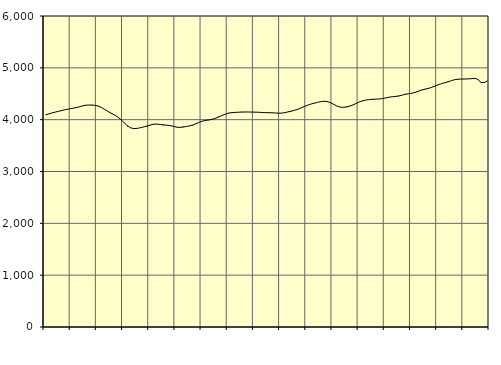
| Category | Piggar | Series 1 |
|---|---|---|
| nan | 4091.3 | 4093.21 |
| 87.0 | 4110.1 | 4111.59 |
| 87.0 | 4133.1 | 4130.63 |
| 87.0 | 4145.6 | 4147.31 |
| nan | 4162.5 | 4162.02 |
| 88.0 | 4176.1 | 4177.18 |
| 88.0 | 4191.3 | 4191.93 |
| 88.0 | 4205.8 | 4204.94 |
| nan | 4212.8 | 4216.74 |
| 89.0 | 4230.8 | 4228.42 |
| 89.0 | 4241.4 | 4242.96 |
| 89.0 | 4258.3 | 4260.81 |
| nan | 4284 | 4275.98 |
| 90.0 | 4281.9 | 4282.55 |
| 90.0 | 4276 | 4281.77 |
| 90.0 | 4276.9 | 4276.85 |
| nan | 4266.3 | 4263.46 |
| 91.0 | 4240.1 | 4237.16 |
| 91.0 | 4198.9 | 4200.55 |
| 91.0 | 4162.4 | 4161.37 |
| nan | 4119.5 | 4125.39 |
| 92.0 | 4096 | 4091.65 |
| 92.0 | 4055.5 | 4053.82 |
| 92.0 | 4009.6 | 4002.81 |
| nan | 3943.5 | 3940.45 |
| 93.0 | 3871.2 | 3881.8 |
| 93.0 | 3846.6 | 3841.93 |
| 93.0 | 3828.3 | 3827.55 |
| nan | 3831 | 3832.24 |
| 94.0 | 3847.7 | 3845.64 |
| 94.0 | 3858.9 | 3860.38 |
| 94.0 | 3869.7 | 3876.77 |
| nan | 3889.7 | 3896.76 |
| 95.0 | 3919 | 3912.35 |
| 95.0 | 3916.5 | 3914.88 |
| 95.0 | 3899.5 | 3906.78 |
| nan | 3916.6 | 3898.05 |
| 96.0 | 3889.5 | 3893.23 |
| 96.0 | 3886.3 | 3885.99 |
| 96.0 | 3877.9 | 3871.53 |
| nan | 3852.3 | 3856.67 |
| 97.0 | 3847.8 | 3850.93 |
| 97.0 | 3864.8 | 3857.55 |
| 97.0 | 3870.2 | 3868.7 |
| nan | 3883.4 | 3880.48 |
| 98.0 | 3891.2 | 3897.76 |
| 98.0 | 3923.4 | 3922.42 |
| 98.0 | 3949.8 | 3949.58 |
| nan | 3974.6 | 3973.34 |
| 99.0 | 3986.9 | 3986.83 |
| 99.0 | 3992.2 | 3995.42 |
| 99.0 | 4004.8 | 4008.75 |
| nan | 4029 | 4030.23 |
| 0.0 | 4067.7 | 4055.84 |
| 0.0 | 4074.1 | 4082.79 |
| 0.0 | 4109.9 | 4108.43 |
| nan | 4131.6 | 4127.05 |
| 1.0 | 4128.7 | 4136.18 |
| 1.0 | 4143.1 | 4140.09 |
| 1.0 | 4145.8 | 4143.87 |
| nan | 4150.8 | 4146.82 |
| 2.0 | 4149.1 | 4147.99 |
| 2.0 | 4147.5 | 4147.69 |
| 2.0 | 4147.1 | 4146.29 |
| nan | 4142.7 | 4144.96 |
| 3.0 | 4146 | 4143.61 |
| 3.0 | 4141.2 | 4139.61 |
| 3.0 | 4134.6 | 4135.47 |
| nan | 4127.6 | 4134.32 |
| 4.0 | 4128 | 4133.23 |
| 4.0 | 4128.4 | 4129.74 |
| 4.0 | 4121.4 | 4125.48 |
| nan | 4127.2 | 4126.06 |
| 5.0 | 4135.2 | 4134.4 |
| 5.0 | 4150.9 | 4148.27 |
| 5.0 | 4167.7 | 4163.52 |
| nan | 4180.1 | 4179.06 |
| 6.0 | 4190.2 | 4198.62 |
| 6.0 | 4226.2 | 4224.09 |
| 6.0 | 4250 | 4252.27 |
| nan | 4276.2 | 4278.12 |
| 7.0 | 4299.5 | 4299.5 |
| 7.0 | 4314.5 | 4316.77 |
| 7.0 | 4332 | 4332.27 |
| nan | 4348.3 | 4346.36 |
| 8.0 | 4352.2 | 4354.68 |
| 8.0 | 4352.3 | 4350.59 |
| 8.0 | 4329.4 | 4329.75 |
| nan | 4301.5 | 4297.39 |
| 9.0 | 4263.8 | 4263.33 |
| 9.0 | 4241.2 | 4242.41 |
| 9.0 | 4240.1 | 4237.76 |
| nan | 4240.7 | 4246.01 |
| 10.0 | 4266.7 | 4262.54 |
| 10.0 | 4282.4 | 4286.4 |
| 10.0 | 4313.1 | 4315.96 |
| nan | 4347.5 | 4344.93 |
| 11.0 | 4369.1 | 4366.34 |
| 11.0 | 4379.4 | 4379.48 |
| 11.0 | 4388.4 | 4387.74 |
| nan | 4381.7 | 4392.88 |
| 12.0 | 4395.7 | 4395.58 |
| 12.0 | 4397.5 | 4399.33 |
| 12.0 | 4405.9 | 4407.5 |
| nan | 4418.8 | 4420.09 |
| 13.0 | 4433.6 | 4434.26 |
| 13.0 | 4444.8 | 4443.54 |
| 13.0 | 4454.6 | 4448.93 |
| nan | 4453.5 | 4458.13 |
| 14.0 | 4472.7 | 4473.56 |
| 14.0 | 4497.8 | 4489.34 |
| 14.0 | 4495.5 | 4500.31 |
| nan | 4509.8 | 4511.28 |
| 15.0 | 4524.2 | 4528.81 |
| 15.0 | 4548.6 | 4551.52 |
| 15.0 | 4578.1 | 4572.65 |
| nan | 4585.3 | 4590.03 |
| 16.0 | 4610.2 | 4604.83 |
| 16.0 | 4624.9 | 4623.69 |
| 16.0 | 4645.5 | 4648.25 |
| nan | 4682.5 | 4673.97 |
| 17.0 | 4694.3 | 4695.44 |
| 17.0 | 4713.4 | 4712.69 |
| 17.0 | 4724.7 | 4731.71 |
| nan | 4753.2 | 4753.28 |
| 18.0 | 4772.8 | 4770.82 |
| 18.0 | 4774.1 | 4780.56 |
| 18.0 | 4784.3 | 4783.69 |
| nan | 4786.7 | 4784.26 |
| 19.0 | 4787.6 | 4786.05 |
| 19.0 | 4790.9 | 4790.42 |
| 19.0 | 4802.2 | 4797.82 |
| nan | 4779.1 | 4783.75 |
| 20.0 | 4714 | 4716.79 |
| 20.0 | 4716.3 | 4715.15 |
| 20.0 | 4749.5 | 4747.02 |